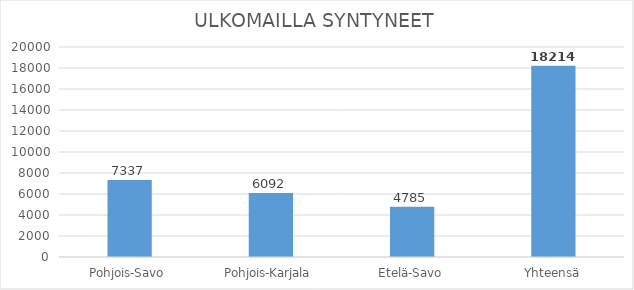
| Category | ULKOMAILLA SYNTYNEET  |
|---|---|
| Pohjois-Savo | 7337 |
| Pohjois-Karjala | 6092 |
| Etelä-Savo | 4785 |
| Yhteensä | 18214 |